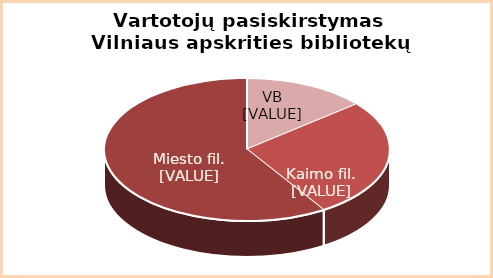
| Category | Series 0 |
|---|---|
| VB | 0.14 |
| KF | 0.27 |
| MF | 0.59 |